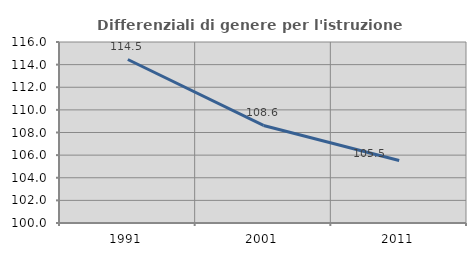
| Category | Differenziali di genere per l'istruzione superiore |
|---|---|
| 1991.0 | 114.454 |
| 2001.0 | 108.625 |
| 2011.0 | 105.52 |